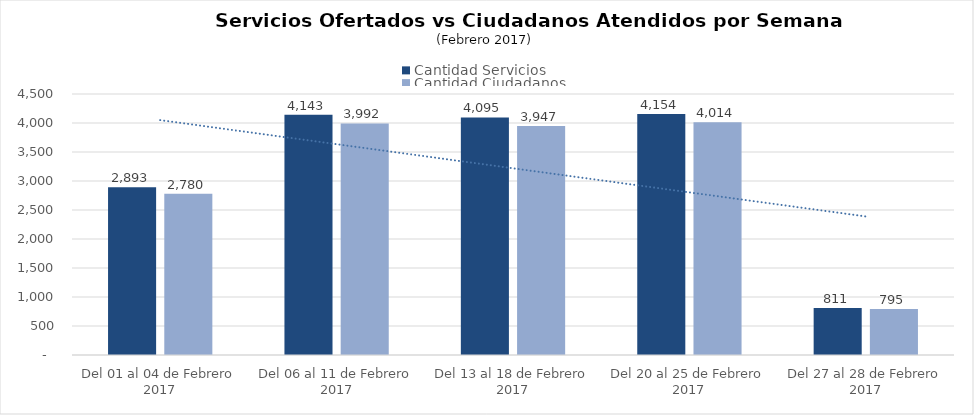
| Category | Cantidad Servicios | Cantidad Ciudadanos |
|---|---|---|
| Del 01 al 04 de Febrero 2017 | 2893 | 2780 |
| Del 06 al 11 de Febrero 2017 | 4143 | 3992 |
| Del 13 al 18 de Febrero 2017 | 4095 | 3947 |
| Del 20 al 25 de Febrero 2017 | 4154 | 4014 |
| Del 27 al 28 de Febrero 2017 | 811 | 795 |